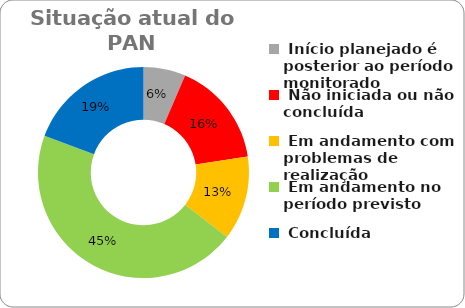
| Category | Series 0 |
|---|---|
|  Início planejado é posterior ao período monitorado | 0.065 |
|  Não iniciada ou não concluída | 0.161 |
|  Em andamento com problemas de realização | 0.129 |
|  Em andamento no período previsto  | 0.452 |
|  Concluída | 0.194 |